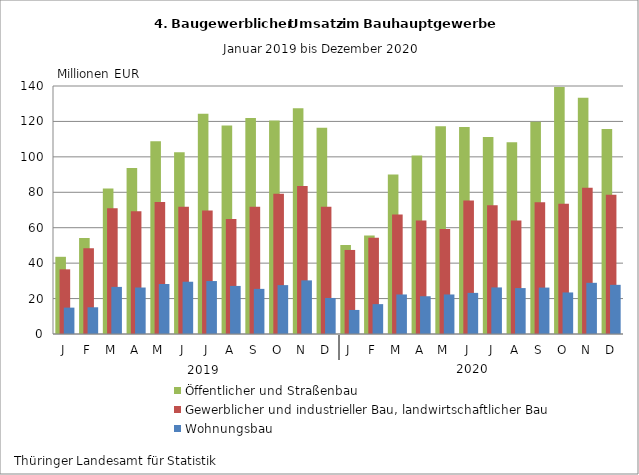
| Category | Öffentlicher und Straßenbau | Gewerblicher und industrieller Bau, landwirtschaftlicher Bau | Wohnungsbau |
|---|---|---|---|
| J | 43.577 | 36.503 | 14.894 |
| F | 54.231 | 48.423 | 15.079 |
| M | 82.117 | 70.999 | 26.584 |
| A | 93.712 | 69.355 | 26.237 |
| M | 108.75 | 74.527 | 28.236 |
| J | 102.548 | 71.806 | 29.507 |
| J | 124.393 | 69.699 | 29.893 |
| A | 117.692 | 64.926 | 27.134 |
| S | 121.961 | 71.829 | 25.473 |
| O | 120.583 | 79.112 | 27.59 |
| N | 127.409 | 83.579 | 30.274 |
| D | 116.474 | 71.868 | 20.344 |
| J | 50.231 | 47.441 | 13.583 |
| F | 55.565 | 54.391 | 16.869 |
| M | 90.097 | 67.394 | 22.313 |
| A | 100.768 | 64.052 | 21.314 |
| M | 117.292 | 59.335 | 22.312 |
| J | 116.853 | 75.353 | 23.216 |
| J | 111.264 | 72.642 | 26.295 |
| A | 108.24 | 64.127 | 25.922 |
| S | 119.88 | 74.433 | 26.207 |
| O | 139.435 | 73.565 | 23.454 |
| N | 133.307 | 82.539 | 28.897 |
| D | 115.668 | 78.63 | 27.752 |